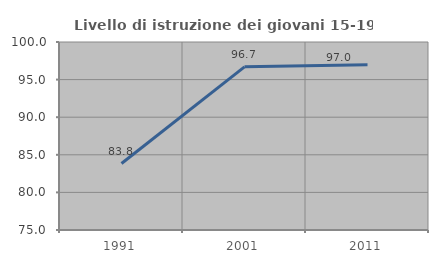
| Category | Livello di istruzione dei giovani 15-19 anni |
|---|---|
| 1991.0 | 83.838 |
| 2001.0 | 96.694 |
| 2011.0 | 96.97 |